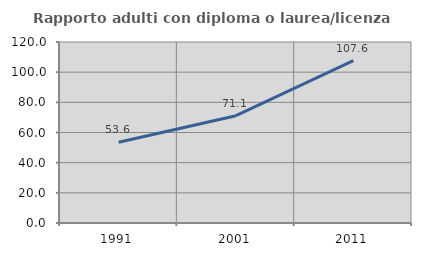
| Category | Rapporto adulti con diploma o laurea/licenza media  |
|---|---|
| 1991.0 | 53.571 |
| 2001.0 | 71.123 |
| 2011.0 | 107.643 |